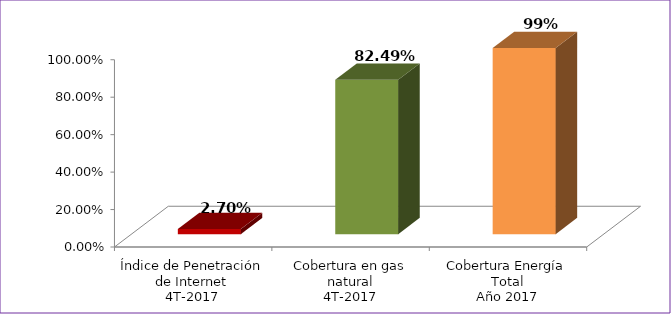
| Category | Series 0 |
|---|---|
| Índice de Penetración de Internet
4T-2017 | 0.027 |
| Cobertura en gas natural
4T-2017 | 0.825 |
| Cobertura Energía Total
Año 2017 | 0.994 |